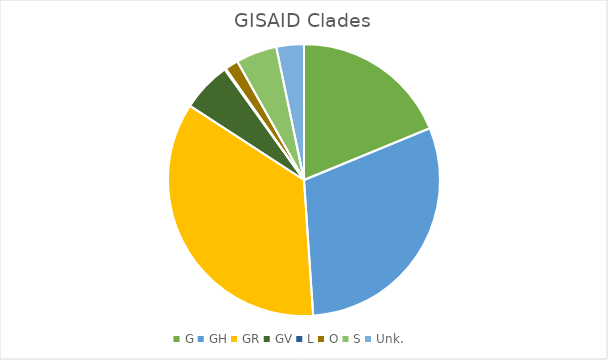
| Category | Series 0 |
|---|---|
| G | 235 |
| GH | 377 |
| GR | 441 |
| GV | 74 |
| L | 2 |
| O | 20 |
| S | 61 |
| Unk. | 41 |